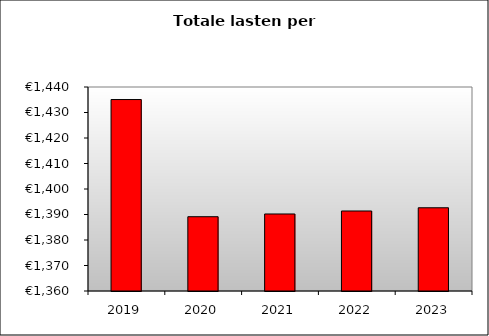
| Category | Series 0 |
|---|---|
| 2019.0 | 1435.082 |
| 2020.0 | 1389.131 |
| 2021.0 | 1390.202 |
| 2022.0 | 1391.373 |
| 2023.0 | 1392.64 |